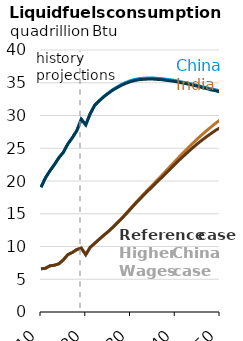
| Category | Liq-IIF-CHI | Liq-IIF-IND | Liq-Ref-CHI | Liq-Ref-IND |
|---|---|---|---|---|
| 2010.0 | 19.04 | 6.596 | 19.04 | 6.596 |
| 2011.0 | 20.487 | 6.674 | 20.487 | 6.674 |
| 2012.0 | 21.559 | 7.058 | 21.559 | 7.058 |
| 2013.0 | 22.505 | 7.138 | 22.505 | 7.138 |
| 2014.0 | 23.563 | 7.362 | 23.563 | 7.362 |
| 2015.0 | 24.385 | 7.968 | 24.385 | 7.968 |
| 2016.0 | 25.663 | 8.756 | 25.663 | 8.756 |
| 2017.0 | 26.606 | 9.087 | 26.606 | 9.087 |
| 2018.0 | 27.688 | 9.532 | 27.688 | 9.532 |
| 2019.0 | 29.425 | 9.758 | 29.425 | 9.758 |
| 2020.0 | 28.575 | 8.749 | 28.575 | 8.749 |
| 2021.0 | 30.28 | 9.88 | 30.28 | 9.88 |
| 2022.0 | 31.554 | 10.481 | 31.554 | 10.481 |
| 2023.0 | 32.236 | 11.106 | 32.232 | 11.103 |
| 2024.0 | 32.875 | 11.707 | 32.848 | 11.697 |
| 2025.0 | 33.414 | 12.278 | 33.359 | 12.261 |
| 2026.0 | 33.936 | 12.914 | 33.857 | 12.887 |
| 2027.0 | 34.348 | 13.584 | 34.249 | 13.544 |
| 2028.0 | 34.743 | 14.293 | 34.624 | 14.239 |
| 2029.0 | 35.058 | 15.035 | 34.918 | 14.961 |
| 2030.0 | 35.321 | 15.808 | 35.168 | 15.714 |
| 2031.0 | 35.51 | 16.578 | 35.348 | 16.461 |
| 2032.0 | 35.64 | 17.314 | 35.473 | 17.171 |
| 2033.0 | 35.695 | 18.05 | 35.529 | 17.879 |
| 2034.0 | 35.729 | 18.756 | 35.566 | 18.554 |
| 2035.0 | 35.726 | 19.457 | 35.563 | 19.221 |
| 2036.0 | 35.671 | 20.159 | 35.511 | 19.888 |
| 2037.0 | 35.626 | 20.871 | 35.466 | 20.56 |
| 2038.0 | 35.527 | 21.587 | 35.37 | 21.233 |
| 2039.0 | 35.441 | 22.328 | 35.288 | 21.928 |
| 2040.0 | 35.324 | 23.043 | 35.177 | 22.594 |
| 2041.0 | 35.195 | 23.761 | 35.051 | 23.26 |
| 2042.0 | 35.047 | 24.456 | 34.908 | 23.897 |
| 2043.0 | 34.918 | 25.145 | 34.782 | 24.525 |
| 2044.0 | 34.752 | 25.808 | 34.618 | 25.125 |
| 2045.0 | 34.602 | 26.469 | 34.47 | 25.709 |
| 2046.0 | 34.409 | 27.079 | 34.274 | 26.247 |
| 2047.0 | 34.254 | 27.68 | 34.113 | 26.771 |
| 2048.0 | 34.056 | 28.246 | 33.909 | 27.256 |
| 2049.0 | 33.939 | 28.808 | 33.785 | 27.729 |
| 2050.0 | 33.745 | 29.296 | 33.588 | 28.132 |